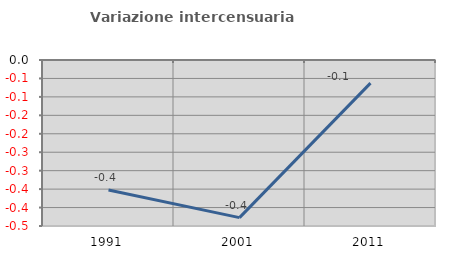
| Category | Variazione intercensuaria annua |
|---|---|
| 1991.0 | -0.352 |
| 2001.0 | -0.427 |
| 2011.0 | -0.063 |